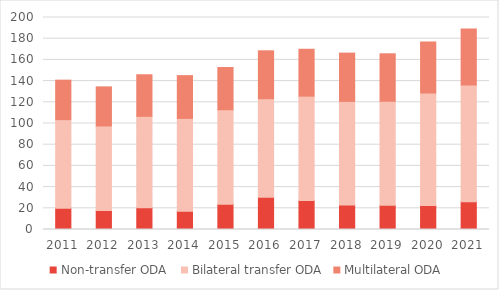
| Category | Non-transfer ODA  | Bilateral transfer ODA | Multilateral ODA |
|---|---|---|---|
| 2011.0 | 20.073 | 83.577 | 37.233 |
| 2012.0 | 17.812 | 79.887 | 36.862 |
| 2013.0 | 20.404 | 86.37 | 39.204 |
| 2014.0 | 17.217 | 87.598 | 40.343 |
| 2015.0 | 23.916 | 89.07 | 39.82 |
| 2016.0 | 30.357 | 93.039 | 45.182 |
| 2017.0 | 27.433 | 98.376 | 44.228 |
| 2018.0 | 23.053 | 97.805 | 45.536 |
| 2019.0 | 22.905 | 98.077 | 44.79 |
| 2020.0 | 22.566 | 106.325 | 47.989 |
| 2021.0 | 26.194 | 110.221 | 52.698 |